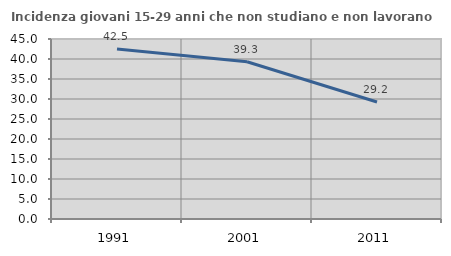
| Category | Incidenza giovani 15-29 anni che non studiano e non lavorano  |
|---|---|
| 1991.0 | 42.51 |
| 2001.0 | 39.319 |
| 2011.0 | 29.242 |